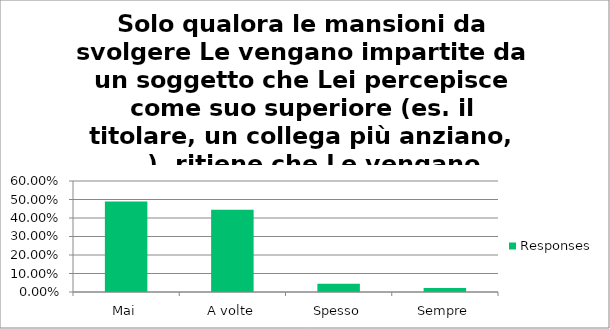
| Category | Responses |
|---|---|
| Mai | 0.489 |
| A volte | 0.444 |
| Spesso | 0.044 |
| Sempre | 0.022 |